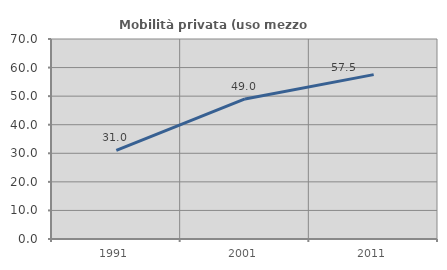
| Category | Mobilità privata (uso mezzo privato) |
|---|---|
| 1991.0 | 30.989 |
| 2001.0 | 49.024 |
| 2011.0 | 57.533 |